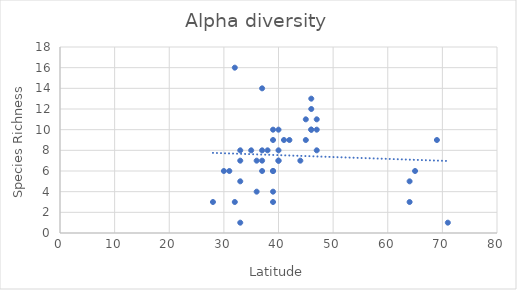
| Category | Alpha_Diversity |
|---|---|
| 46.0 | 10 |
| 71.0 | 1 |
| 44.0 | 7 |
| 39.0 | 6 |
| 65.0 | 6 |
| 33.0 | 7 |
| 41.0 | 9 |
| 47.0 | 8 |
| 64.0 | 3 |
| 33.0 | 1 |
| 28.0 | 3 |
| 36.0 | 4 |
| 42.0 | 9 |
| 64.0 | 5 |
| 31.0 | 6 |
| 33.0 | 5 |
| 39.0 | 3 |
| 39.0 | 9 |
| 32.0 | 3 |
| 37.0 | 14 |
| 38.0 | 8 |
| 40.0 | 7 |
| 47.0 | 11 |
| 35.0 | 8 |
| 40.0 | 8 |
| 36.0 | 7 |
| 30.0 | 6 |
| 40.0 | 7 |
| 39.0 | 10 |
| 39.0 | 6 |
| 37.0 | 7 |
| 37.0 | 6 |
| 32.0 | 16 |
| 46.0 | 10 |
| 40.0 | 10 |
| 33.0 | 8 |
| 37.0 | 8 |
| 69.0 | 9 |
| 45.0 | 11 |
| 39.0 | 4 |
| 46.0 | 13 |
| 47.0 | 10 |
| 46.0 | 12 |
| 45.0 | 9 |